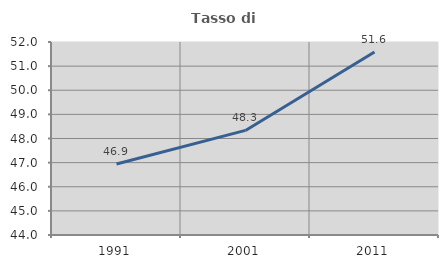
| Category | Tasso di occupazione   |
|---|---|
| 1991.0 | 46.942 |
| 2001.0 | 48.335 |
| 2011.0 | 51.584 |